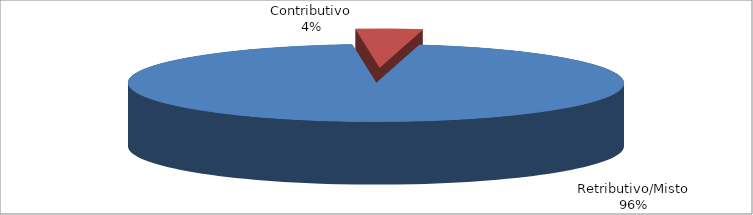
| Category | Decorrenti gennaio - settembre 2021 |
|---|---|
| Retributivo/Misto | 95264 |
| Contributivo | 4298 |